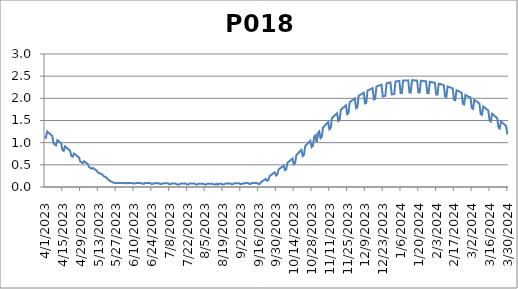
| Category | P018 |
|---|---|
| 4/1/23 | 1.137 |
| 4/2/23 | 1.114 |
| 4/3/23 | 1.252 |
| 4/4/23 | 1.227 |
| 4/5/23 | 1.202 |
| 4/6/23 | 1.177 |
| 4/7/23 | 1.153 |
| 4/8/23 | 0.982 |
| 4/9/23 | 0.96 |
| 4/10/23 | 0.938 |
| 4/11/23 | 1.057 |
| 4/12/23 | 1.032 |
| 4/13/23 | 1.008 |
| 4/14/23 | 0.985 |
| 4/15/23 | 0.833 |
| 4/16/23 | 0.813 |
| 4/17/23 | 0.914 |
| 4/18/23 | 0.891 |
| 4/19/23 | 0.868 |
| 4/20/23 | 0.845 |
| 4/21/23 | 0.822 |
| 4/22/23 | 0.701 |
| 4/23/23 | 0.683 |
| 4/24/23 | 0.756 |
| 4/25/23 | 0.734 |
| 4/26/23 | 0.711 |
| 4/27/23 | 0.689 |
| 4/28/23 | 0.668 |
| 4/29/23 | 0.574 |
| 4/30/23 | 0.556 |
| 5/1/23 | 0.537 |
| 5/2/23 | 0.58 |
| 5/3/23 | 0.56 |
| 5/4/23 | 0.538 |
| 5/5/23 | 0.516 |
| 5/6/23 | 0.448 |
| 5/7/23 | 0.43 |
| 5/8/23 | 0.413 |
| 5/9/23 | 0.43 |
| 5/10/23 | 0.409 |
| 5/11/23 | 0.387 |
| 5/12/23 | 0.367 |
| 5/13/23 | 0.326 |
| 5/14/23 | 0.309 |
| 5/15/23 | 0.305 |
| 5/16/23 | 0.285 |
| 5/17/23 | 0.265 |
| 5/18/23 | 0.234 |
| 5/19/23 | 0.225 |
| 5/20/23 | 0.196 |
| 5/21/23 | 0.17 |
| 5/22/23 | 0.145 |
| 5/23/23 | 0.126 |
| 5/24/23 | 0.114 |
| 5/25/23 | 0.102 |
| 5/26/23 | 0.091 |
| 5/27/23 | 0.091 |
| 5/28/23 | 0.09 |
| 5/29/23 | 0.089 |
| 5/30/23 | 0.089 |
| 5/31/23 | 0.089 |
| 6/1/23 | 0.089 |
| 6/2/23 | 0.089 |
| 6/3/23 | 0.085 |
| 6/4/23 | 0.084 |
| 6/5/23 | 0.09 |
| 6/6/23 | 0.09 |
| 6/7/23 | 0.091 |
| 6/8/23 | 0.091 |
| 6/9/23 | 0.091 |
| 6/10/23 | 0.078 |
| 6/11/23 | 0.077 |
| 6/12/23 | 0.092 |
| 6/13/23 | 0.092 |
| 6/14/23 | 0.093 |
| 6/15/23 | 0.093 |
| 6/16/23 | 0.092 |
| 6/17/23 | 0.072 |
| 6/18/23 | 0.072 |
| 6/19/23 | 0.091 |
| 6/20/23 | 0.09 |
| 6/21/23 | 0.09 |
| 6/22/23 | 0.089 |
| 6/23/23 | 0.089 |
| 6/24/23 | 0.069 |
| 6/25/23 | 0.068 |
| 6/26/23 | 0.087 |
| 6/27/23 | 0.087 |
| 6/28/23 | 0.086 |
| 6/29/23 | 0.086 |
| 6/30/23 | 0.086 |
| 7/1/23 | 0.065 |
| 7/2/23 | 0.065 |
| 7/3/23 | 0.084 |
| 7/4/23 | 0.084 |
| 7/5/23 | 0.083 |
| 7/6/23 | 0.083 |
| 7/7/23 | 0.082 |
| 7/8/23 | 0.062 |
| 7/9/23 | 0.061 |
| 7/10/23 | 0.081 |
| 7/11/23 | 0.08 |
| 7/12/23 | 0.08 |
| 7/13/23 | 0.079 |
| 7/14/23 | 0.059 |
| 7/15/23 | 0.058 |
| 7/16/23 | 0.058 |
| 7/17/23 | 0.078 |
| 7/18/23 | 0.078 |
| 7/19/23 | 0.078 |
| 7/20/23 | 0.077 |
| 7/21/23 | 0.077 |
| 7/22/23 | 0.057 |
| 7/23/23 | 0.057 |
| 7/24/23 | 0.077 |
| 7/25/23 | 0.077 |
| 7/26/23 | 0.076 |
| 7/27/23 | 0.076 |
| 7/28/23 | 0.076 |
| 7/29/23 | 0.056 |
| 7/30/23 | 0.056 |
| 7/31/23 | 0.076 |
| 8/1/23 | 0.076 |
| 8/2/23 | 0.076 |
| 8/3/23 | 0.075 |
| 8/4/23 | 0.075 |
| 8/5/23 | 0.055 |
| 8/6/23 | 0.055 |
| 8/7/23 | 0.075 |
| 8/8/23 | 0.075 |
| 8/9/23 | 0.075 |
| 8/10/23 | 0.074 |
| 8/11/23 | 0.074 |
| 8/12/23 | 0.054 |
| 8/13/23 | 0.054 |
| 8/14/23 | 0.074 |
| 8/15/23 | 0.054 |
| 8/16/23 | 0.074 |
| 8/17/23 | 0.075 |
| 8/18/23 | 0.076 |
| 8/19/23 | 0.056 |
| 8/20/23 | 0.057 |
| 8/21/23 | 0.077 |
| 8/22/23 | 0.078 |
| 8/23/23 | 0.079 |
| 8/24/23 | 0.079 |
| 8/25/23 | 0.08 |
| 8/26/23 | 0.061 |
| 8/27/23 | 0.061 |
| 8/28/23 | 0.082 |
| 8/29/23 | 0.083 |
| 8/30/23 | 0.083 |
| 8/31/23 | 0.084 |
| 9/1/23 | 0.084 |
| 9/2/23 | 0.065 |
| 9/3/23 | 0.065 |
| 9/4/23 | 0.086 |
| 9/5/23 | 0.086 |
| 9/6/23 | 0.087 |
| 9/7/23 | 0.088 |
| 9/8/23 | 0.088 |
| 9/9/23 | 0.069 |
| 9/10/23 | 0.07 |
| 9/11/23 | 0.09 |
| 9/12/23 | 0.091 |
| 9/13/23 | 0.092 |
| 9/14/23 | 0.092 |
| 9/15/23 | 0.093 |
| 9/16/23 | 0.07 |
| 9/17/23 | 0.067 |
| 9/18/23 | 0.102 |
| 9/19/23 | 0.126 |
| 9/20/23 | 0.144 |
| 9/21/23 | 0.162 |
| 9/22/23 | 0.183 |
| 9/23/23 | 0.14 |
| 9/24/23 | 0.159 |
| 9/25/23 | 0.247 |
| 9/26/23 | 0.27 |
| 9/27/23 | 0.29 |
| 9/28/23 | 0.312 |
| 9/29/23 | 0.333 |
| 9/30/23 | 0.26 |
| 10/1/23 | 0.278 |
| 10/2/23 | 0.396 |
| 10/3/23 | 0.419 |
| 10/4/23 | 0.439 |
| 10/5/23 | 0.46 |
| 10/6/23 | 0.482 |
| 10/7/23 | 0.379 |
| 10/8/23 | 0.397 |
| 10/9/23 | 0.547 |
| 10/10/23 | 0.569 |
| 10/11/23 | 0.594 |
| 10/12/23 | 0.617 |
| 10/13/23 | 0.643 |
| 10/14/23 | 0.515 |
| 10/15/23 | 0.535 |
| 10/16/23 | 0.722 |
| 10/17/23 | 0.75 |
| 10/18/23 | 0.778 |
| 10/19/23 | 0.808 |
| 10/20/23 | 0.836 |
| 10/21/23 | 0.701 |
| 10/22/23 | 0.729 |
| 10/23/23 | 0.924 |
| 10/24/23 | 0.954 |
| 10/25/23 | 0.983 |
| 10/26/23 | 1.012 |
| 10/27/23 | 1.043 |
| 10/28/23 | 0.9 |
| 10/29/23 | 0.93 |
| 10/30/23 | 1.132 |
| 10/31/23 | 1.163 |
| 11/1/23 | 1.014 |
| 11/2/23 | 1.222 |
| 11/3/23 | 1.253 |
| 11/4/23 | 1.1 |
| 11/5/23 | 1.13 |
| 11/6/23 | 1.342 |
| 11/7/23 | 1.372 |
| 11/8/23 | 1.404 |
| 11/9/23 | 1.433 |
| 11/10/23 | 1.464 |
| 11/11/23 | 1.301 |
| 11/12/23 | 1.33 |
| 11/13/23 | 1.552 |
| 11/14/23 | 1.581 |
| 11/15/23 | 1.611 |
| 11/16/23 | 1.637 |
| 11/17/23 | 1.664 |
| 11/18/23 | 1.487 |
| 11/19/23 | 1.51 |
| 11/20/23 | 1.744 |
| 11/21/23 | 1.768 |
| 11/22/23 | 1.793 |
| 11/23/23 | 1.819 |
| 11/24/23 | 1.843 |
| 11/25/23 | 1.643 |
| 11/26/23 | 1.663 |
| 11/27/23 | 1.913 |
| 11/28/23 | 1.935 |
| 11/29/23 | 1.956 |
| 11/30/23 | 1.976 |
| 12/1/23 | 1.998 |
| 12/2/23 | 1.777 |
| 12/3/23 | 1.795 |
| 12/4/23 | 2.057 |
| 12/5/23 | 2.075 |
| 12/6/23 | 2.091 |
| 12/7/23 | 2.109 |
| 12/8/23 | 2.127 |
| 12/9/23 | 1.887 |
| 12/10/23 | 1.9 |
| 12/11/23 | 2.173 |
| 12/12/23 | 2.188 |
| 12/13/23 | 2.201 |
| 12/14/23 | 2.215 |
| 12/15/23 | 2.231 |
| 12/16/23 | 1.974 |
| 12/17/23 | 1.987 |
| 12/18/23 | 2.266 |
| 12/19/23 | 2.278 |
| 12/20/23 | 2.286 |
| 12/21/23 | 2.298 |
| 12/22/23 | 2.307 |
| 12/23/23 | 2.043 |
| 12/24/23 | 2.051 |
| 12/25/23 | 2.057 |
| 12/26/23 | 2.34 |
| 12/27/23 | 2.347 |
| 12/28/23 | 2.354 |
| 12/29/23 | 2.36 |
| 12/30/23 | 2.09 |
| 12/31/23 | 2.093 |
| 1/1/24 | 2.099 |
| 1/2/24 | 2.38 |
| 1/3/24 | 2.385 |
| 1/4/24 | 2.388 |
| 1/5/24 | 2.392 |
| 1/6/24 | 2.117 |
| 1/7/24 | 2.121 |
| 1/8/24 | 2.4 |
| 1/9/24 | 2.4 |
| 1/10/24 | 2.403 |
| 1/11/24 | 2.403 |
| 1/12/24 | 2.405 |
| 1/13/24 | 2.132 |
| 1/14/24 | 2.132 |
| 1/15/24 | 2.406 |
| 1/16/24 | 2.405 |
| 1/17/24 | 2.405 |
| 1/18/24 | 2.404 |
| 1/19/24 | 2.402 |
| 1/20/24 | 2.132 |
| 1/21/24 | 2.131 |
| 1/22/24 | 2.397 |
| 1/23/24 | 2.394 |
| 1/24/24 | 2.391 |
| 1/25/24 | 2.387 |
| 1/26/24 | 2.384 |
| 1/27/24 | 2.118 |
| 1/28/24 | 2.115 |
| 1/29/24 | 2.372 |
| 1/30/24 | 2.368 |
| 1/31/24 | 2.363 |
| 2/1/24 | 2.356 |
| 2/2/24 | 2.349 |
| 2/3/24 | 2.088 |
| 2/4/24 | 2.083 |
| 2/5/24 | 2.33 |
| 2/6/24 | 2.322 |
| 2/7/24 | 2.315 |
| 2/8/24 | 2.306 |
| 2/9/24 | 2.296 |
| 2/10/24 | 2.04 |
| 2/11/24 | 2.032 |
| 2/12/24 | 2.268 |
| 2/13/24 | 2.256 |
| 2/14/24 | 2.247 |
| 2/15/24 | 2.235 |
| 2/16/24 | 2.222 |
| 2/17/24 | 1.97 |
| 2/18/24 | 1.959 |
| 2/19/24 | 2.183 |
| 2/20/24 | 2.17 |
| 2/21/24 | 2.156 |
| 2/22/24 | 2.141 |
| 2/23/24 | 2.124 |
| 2/24/24 | 1.877 |
| 2/25/24 | 1.863 |
| 2/26/24 | 2.076 |
| 2/27/24 | 2.059 |
| 2/28/24 | 2.041 |
| 2/29/24 | 2.031 |
| 3/1/24 | 2.022 |
| 3/2/24 | 1.782 |
| 3/3/24 | 1.763 |
| 3/4/24 | 1.965 |
| 3/5/24 | 1.944 |
| 3/6/24 | 1.925 |
| 3/7/24 | 1.903 |
| 3/8/24 | 1.882 |
| 3/9/24 | 1.647 |
| 3/10/24 | 1.628 |
| 3/11/24 | 1.816 |
| 3/12/24 | 1.796 |
| 3/13/24 | 1.771 |
| 3/14/24 | 1.748 |
| 3/15/24 | 1.724 |
| 3/16/24 | 1.5 |
| 3/17/24 | 1.478 |
| 3/18/24 | 1.651 |
| 3/19/24 | 1.626 |
| 3/20/24 | 1.604 |
| 3/21/24 | 1.578 |
| 3/22/24 | 1.553 |
| 3/23/24 | 1.343 |
| 3/24/24 | 1.318 |
| 3/25/24 | 1.478 |
| 3/26/24 | 1.452 |
| 3/27/24 | 1.427 |
| 3/28/24 | 1.402 |
| 3/29/24 | 1.376 |
| 3/30/24 | 1.183 |